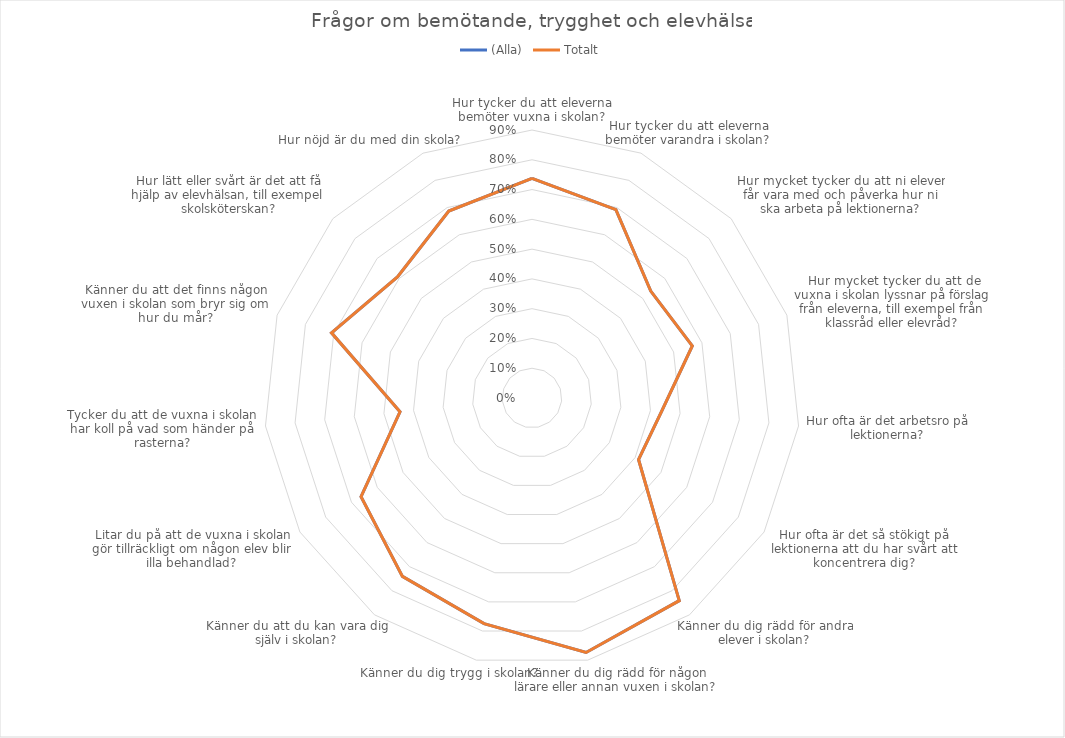
| Category | (Alla) | Totalt |
|---|---|---|
| Hur tycker du att eleverna bemöter vuxna i skolan? | 0.738 | 0.738 |
| Hur tycker du att eleverna bemöter varandra i skolan? | 0.693 | 0.693 |
| Hur mycket tycker du att ni elever får vara med och påverka hur ni ska arbeta på lektionerna? | 0.537 | 0.537 |
| Hur mycket tycker du att de vuxna i skolan lyssnar på förslag från eleverna, till exempel från klassråd eller elevråd? | 0.566 | 0.566 |
| Hur ofta är det arbetsro på lektionerna? | 0.437 | 0.437 |
| Hur ofta är det så stökigt på lektionerna att du har svårt att koncentrera dig? | 0.413 | 0.413 |
| Känner du dig rädd för andra elever i skolan? | 0.841 | 0.841 |
| Känner du dig rädd för någon lärare eller annan vuxen i skolan? | 0.874 | 0.874 |
| Känner du dig trygg i skolan? | 0.775 | 0.775 |
| Känner du att du kan vara dig själv i skolan? | 0.74 | 0.74 |
| Litar du på att de vuxna i skolan gör tillräckligt om någon elev blir illa behandlad? | 0.663 | 0.663 |
| Tycker du att de vuxna i skolan har koll på vad som händer på rasterna? | 0.446 | 0.446 |
| Känner du att det finns någon vuxen i skolan som bryr sig om hur du mår? | 0.708 | 0.708 |
| Hur lätt eller svårt är det att få hjälp av elevhälsan, till exempel skolsköterskan? | 0.608 | 0.608 |
| Hur nöjd är du med din skola? | 0.687 | 0.687 |